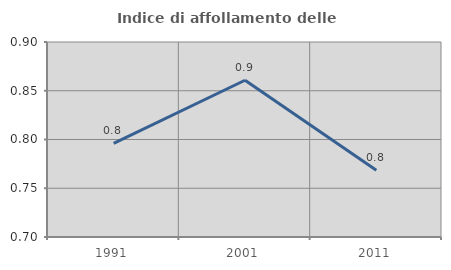
| Category | Indice di affollamento delle abitazioni  |
|---|---|
| 1991.0 | 0.796 |
| 2001.0 | 0.861 |
| 2011.0 | 0.769 |